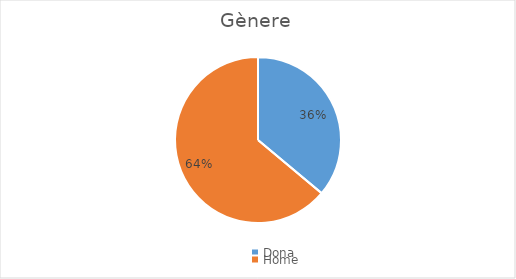
| Category | Series 0 |
|---|---|
| Dona | 35 |
| Home | 62 |